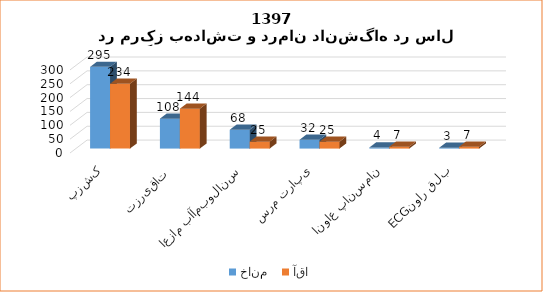
| Category | خانم  | آقا |
|---|---|---|
| پزشک | 295 | 234 |
| تزریقات  | 108 | 144 |
| اعزام باآمبولانس | 68 | 25 |
| سرم تراپی | 32 | 25 |
| انواع پانسمان | 4 | 7 |
| ECGنوار قلب | 3 | 7 |